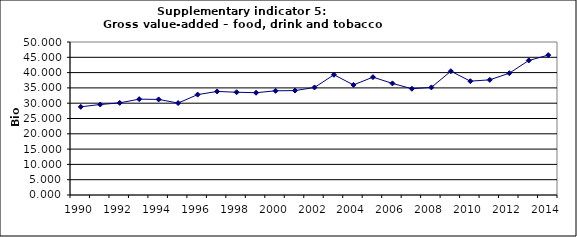
| Category | Gross value-added – food, drink and tobacco industry, Bio Euro (EC95) |
|---|---|
| 1990 | 28.82 |
| 1991 | 29.574 |
| 1992 | 30.108 |
| 1993 | 31.317 |
| 1994 | 31.238 |
| 1995 | 30.037 |
| 1996 | 32.805 |
| 1997 | 33.84 |
| 1998 | 33.581 |
| 1999 | 33.424 |
| 2000 | 34.049 |
| 2001 | 34.121 |
| 2002 | 35.143 |
| 2003 | 39.291 |
| 2004 | 35.975 |
| 2005 | 38.515 |
| 2006 | 36.464 |
| 2007 | 34.725 |
| 2008 | 35.168 |
| 2009 | 40.453 |
| 2010 | 37.199 |
| 2011 | 37.635 |
| 2012 | 39.811 |
| 2013 | 43.964 |
| 2014 | 45.716 |